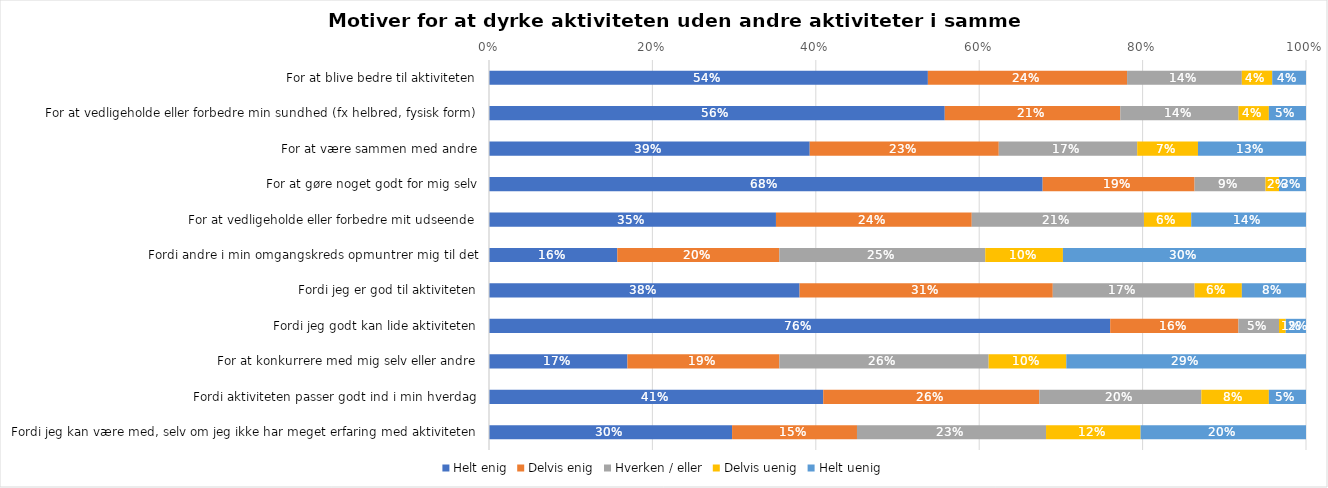
| Category | Helt enig | Delvis enig | Hverken / eller | Delvis uenig | Helt uenig |
|---|---|---|---|---|---|
| For at blive bedre til aktiviteten | 0.537 | 0.244 | 0.14 | 0.037 | 0.041 |
| For at vedligeholde eller forbedre min sundhed (fx helbred, fysisk form) | 0.558 | 0.215 | 0.145 | 0.037 | 0.045 |
| For at være sammen med andre | 0.393 | 0.231 | 0.169 | 0.074 | 0.132 |
| For at gøre noget godt for mig selv | 0.678 | 0.186 | 0.087 | 0.017 | 0.033 |
| For at vedligeholde eller forbedre mit udseende | 0.351 | 0.24 | 0.211 | 0.058 | 0.14 |
| Fordi andre i min omgangskreds opmuntrer mig til det | 0.157 | 0.198 | 0.252 | 0.095 | 0.298 |
| Fordi jeg er god til aktiviteten | 0.38 | 0.31 | 0.174 | 0.058 | 0.079 |
| Fordi jeg godt kan lide aktiviteten | 0.76 | 0.157 | 0.05 | 0.008 | 0.025 |
| For at konkurrere med mig selv eller andre | 0.169 | 0.186 | 0.256 | 0.095 | 0.293 |
| Fordi aktiviteten passer godt ind i min hverdag | 0.409 | 0.264 | 0.198 | 0.083 | 0.045 |
| Fordi jeg kan være med, selv om jeg ikke har meget erfaring med aktiviteten | 0.298 | 0.153 | 0.231 | 0.116 | 0.202 |